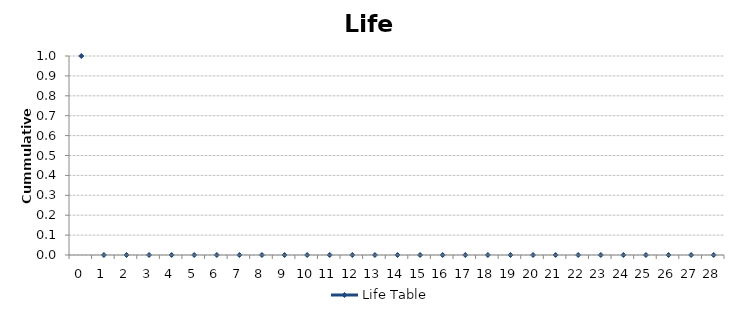
| Category | Life Table |
|---|---|
| 0.0 | 1 |
| 1.0 | 0 |
| 2.0 | 0 |
| 3.0 | 0 |
| 4.0 | 0 |
| 5.0 | 0 |
| 6.0 | 0 |
| 7.0 | 0 |
| 8.0 | 0 |
| 9.0 | 0 |
| 10.0 | 0 |
| 11.0 | 0 |
| 12.0 | 0 |
| 13.0 | 0 |
| 14.0 | 0 |
| 15.0 | 0 |
| 16.0 | 0 |
| 17.0 | 0 |
| 18.0 | 0 |
| 19.0 | 0 |
| 20.0 | 0 |
| 21.0 | 0 |
| 22.0 | 0 |
| 23.0 | 0 |
| 24.0 | 0 |
| 25.0 | 0 |
| 26.0 | 0 |
| 27.0 | 0 |
| 28.0 | 0 |